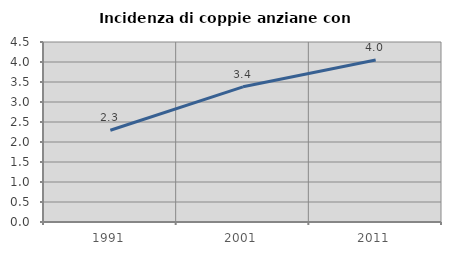
| Category | Incidenza di coppie anziane con figli |
|---|---|
| 1991.0 | 2.294 |
| 2001.0 | 3.379 |
| 2011.0 | 4.049 |